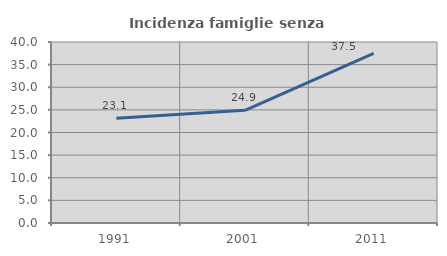
| Category | Incidenza famiglie senza nuclei |
|---|---|
| 1991.0 | 23.15 |
| 2001.0 | 24.904 |
| 2011.0 | 37.507 |